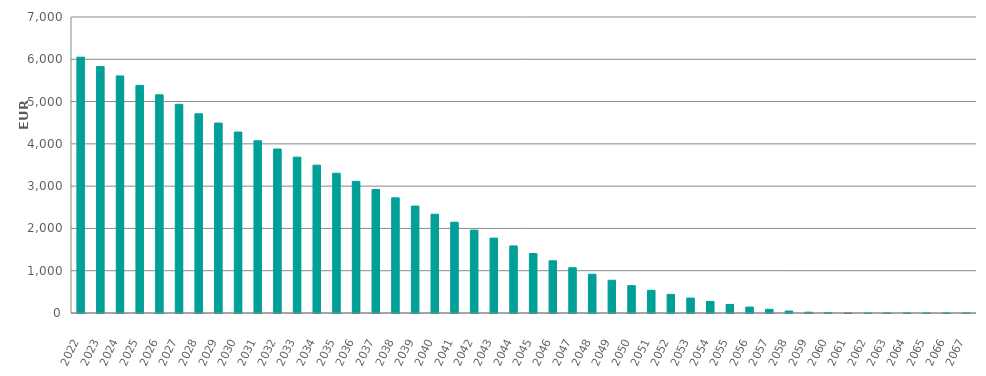
| Category | EUR Millions |
|---|---|
| 2022.0 | 6050000000 |
| 2023.0 | 5826941778.965 |
| 2024.0 | 5606403825.136 |
| 2025.0 | 5383437657.732 |
| 2026.0 | 5159758384.618 |
| 2027.0 | 4935298618.806 |
| 2028.0 | 4710736093.579 |
| 2029.0 | 4491496131.863 |
| 2030.0 | 4279269606.662 |
| 2031.0 | 4074574657.377 |
| 2032.0 | 3877123560.2 |
| 2033.0 | 3685960530.044 |
| 2034.0 | 3496215708.08 |
| 2035.0 | 3304705780.953 |
| 2036.0 | 3113615285.785 |
| 2037.0 | 2919876473.344 |
| 2038.0 | 2722750352.851 |
| 2039.0 | 2527988311.579 |
| 2040.0 | 2336251569.399 |
| 2041.0 | 2147654735.681 |
| 2042.0 | 1959699223.775 |
| 2043.0 | 1770696233.742 |
| 2044.0 | 1586290672.52 |
| 2045.0 | 1406986328.293 |
| 2046.0 | 1234358679.333 |
| 2047.0 | 1070315107.88 |
| 2048.0 | 916315996.125 |
| 2049.0 | 774438397.754 |
| 2050.0 | 647340558.605 |
| 2051.0 | 536845614.463 |
| 2052.0 | 440665375.345 |
| 2053.0 | 353196257.725 |
| 2054.0 | 273980180.458 |
| 2055.0 | 202791079.053 |
| 2056.0 | 140199328.339 |
| 2057.0 | 87364104.907 |
| 2058.0 | 46795741.594 |
| 2059.0 | 19528613.262 |
| 2060.0 | 5328887.087 |
| 2061.0 | 281045.567 |
| 2062.0 | 44256.578 |
| 2063.0 | 12882.411 |
| 2064.0 | 3037.996 |
| 2065.0 | 0 |
| 2066.0 | 0 |
| 2067.0 | 0 |